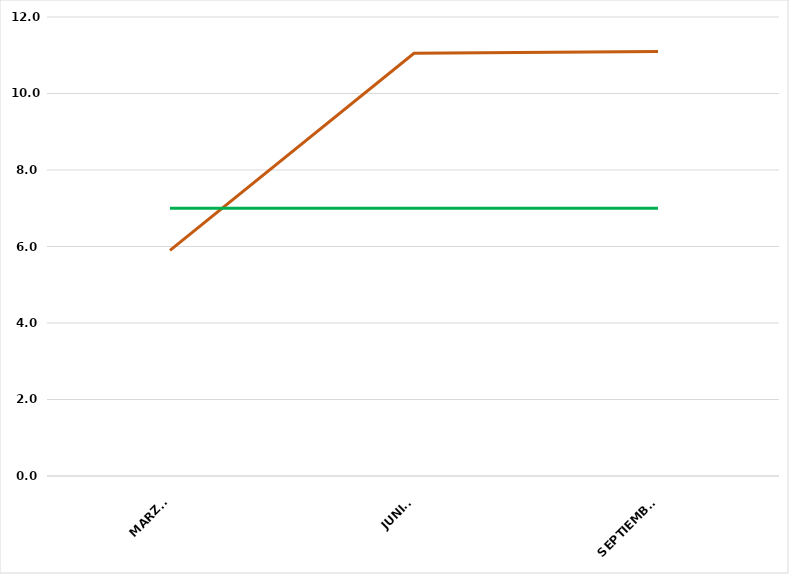
| Category | VALOR  | META PONDERADA |
|---|---|---|
| MARZO | 5.9 | 7 |
| JUNIO | 11.05 | 7 |
| SEPTIEMBRE | 11.1 | 7 |